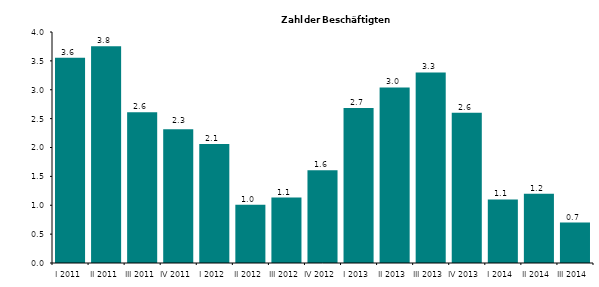
| Category | Series 0 |
|---|---|
| I 2011 | 3.556 |
| II 2011 | 3.754 |
| III 2011 | 2.61 |
| IV 2011 | 2.316 |
| I 2012 | 2.063 |
| II 2012 | 1.009 |
| III 2012 | 1.132 |
| IV 2012 | 1.607 |
| I 2013 | 2.682 |
| II 2013 | 3.039 |
| III 2013 | 3.3 |
| IV 2013 | 2.6 |
| I 2014 | 1.1 |
| II 2014 | 1.2 |
| III 2014 | 0.7 |